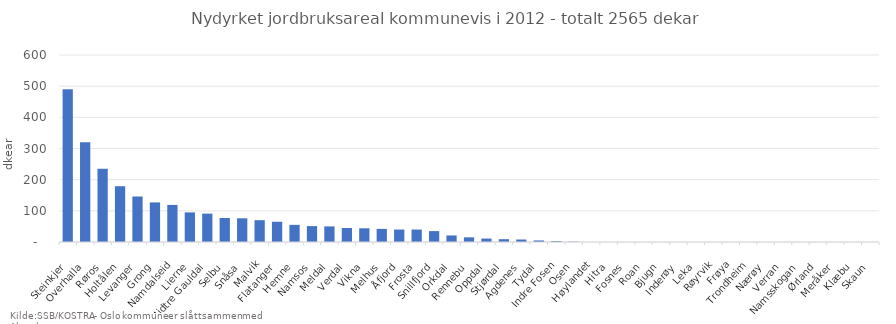
| Category | Totalt |
|---|---|
| Steinkjer | 490 |
| Overhalla | 320 |
| Røros | 235 |
| Holtålen | 179 |
| Levanger | 146 |
| Grong | 127 |
| Namdalseid | 119 |
| Lierne | 95 |
| Midtre Gauldal | 91 |
| Selbu | 77 |
| Snåsa | 76 |
| Malvik | 70 |
| Flatanger | 65 |
| Hemne | 55 |
| Namsos | 51 |
| Meldal | 50 |
| Verdal | 45 |
| Vikna | 44 |
| Melhus | 42 |
| Åfjord | 40 |
| Frosta | 40 |
| Snillfjord | 35 |
| Orkdal | 21 |
| Rennebu | 15 |
| Oppdal | 11 |
| Stjørdal | 9 |
| Agdenes | 8 |
| Tydal | 5 |
| Indre Fosen | 3 |
| Osen | 1 |
| Høylandet | 0 |
| Hitra | 0 |
| Fosnes | 0 |
| Roan | 0 |
| Bjugn | 0 |
| Inderøy | 0 |
| Leka | 0 |
| Røyrvik | 0 |
| Frøya | 0 |
| Trondheim | 0 |
| Nærøy | 0 |
| Verran | 0 |
| Namsskogan | 0 |
| Ørland | 0 |
| Meråker | 0 |
| Klæbu | 0 |
| Skaun | 0 |